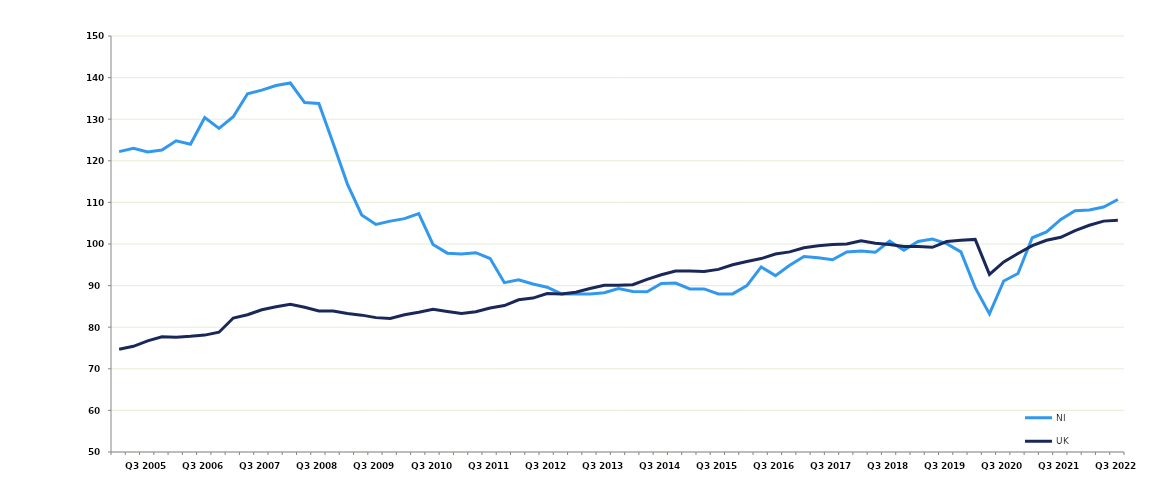
| Category | NI | UK |
|---|---|---|
|  | 122.2 | 74.7 |
|  | 123 | 75.4 |
| Q3 2005 | 122.1 | 76.7 |
|  | 122.6 | 77.7 |
|  | 124.8 | 77.6 |
|  | 124 | 77.8 |
| Q3 2006 | 130.4 | 78.1 |
|  | 127.8 | 78.8 |
|  | 130.6 | 82.2 |
|  | 136.1 | 83 |
| Q3 2007 | 137 | 84.2 |
|  | 138.1 | 84.9 |
|  | 138.7 | 85.5 |
|  | 134 | 84.8 |
| Q3 2008 | 133.8 | 83.9 |
|  | 124.2 | 83.9 |
|  | 114.4 | 83.3 |
|  | 107 | 82.9 |
| Q3 2009 | 104.7 | 82.3 |
|  | 105.5 | 82.1 |
|  | 106.1 | 83 |
|  | 107.3 | 83.6 |
| Q3 2010 | 99.9 | 84.3 |
|  | 97.8 | 83.8 |
|  | 97.6 | 83.3 |
|  | 97.9 | 83.7 |
| Q3 2011 | 96.5 | 84.6 |
|  | 90.7 | 85.2 |
|  | 91.4 | 86.6 |
|  | 90.4 | 87 |
| Q3 2012 | 89.6 | 88.1 |
|  | 88 | 88 |
|  | 88 | 88.4 |
|  | 88 | 89.3 |
| Q3 2013 | 88.3 | 90.1 |
|  | 89.3 | 90.1 |
|  | 88.6 | 90.2 |
|  | 88.5 | 91.5 |
| Q3 2014 | 90.5 | 92.6 |
|  | 90.6 | 93.5 |
|  | 89.2 | 93.5 |
|  | 89.2 | 93.4 |
| Q3 2015 | 88 | 93.9 |
|  | 88 | 95 |
|  | 90 | 95.8 |
|  | 94.5 | 96.5 |
| Q3 2016 | 92.4 | 97.6 |
|  | 94.9 | 98.1 |
|  | 97 | 99.1 |
|  | 96.7 | 99.6 |
| Q3 2017 | 96.2 | 99.9 |
|  | 98.1 | 100 |
|  | 98.3 | 100.8 |
|  | 98 | 100.2 |
| Q3 2018 | 100.7 | 99.9 |
|  | 98.5 | 99.4 |
|  | 100.6 | 99.4 |
|  | 101.2 | 99.2 |
| Q3 2019 | 100.1 | 100.6 |
|  | 98.1 | 100.9 |
|  | 89.5 | 101.1 |
|  | 83.2 | 92.7 |
| Q3 2020 | 91.1 | 95.7 |
|  | 92.9 | 97.7 |
|  | 101.5 | 99.6 |
|  | 102.9 | 100.9 |
| Q3 2021 | 105.9 | 101.6 |
|  | 108 | 103.2 |
|  | 108.2 | 104.5 |
|  | 108.9 | 105.5 |
| Q3 2022 | 110.7 | 105.7 |